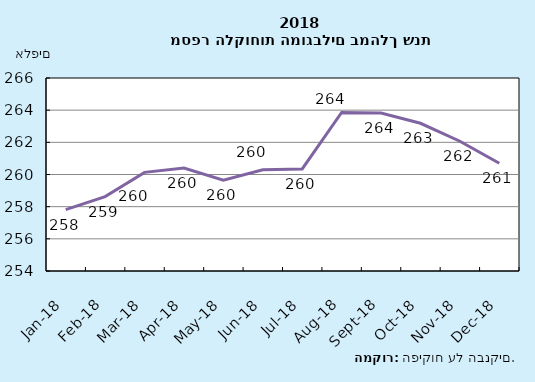
| Category | סה"כ לקוחות |
|---|---|
| 2018-01-31 | 257.814 |
| 2018-02-28 | 258.623 |
| 2018-03-31 | 260.133 |
| 2018-04-30 | 260.399 |
| 2018-05-31 | 259.647 |
| 2018-06-30 | 260.298 |
| 2018-07-31 | 260.348 |
| 2018-08-31 | 263.854 |
| 2018-09-30 | 263.819 |
| 2018-10-31 | 263.185 |
| 2018-11-30 | 262.069 |
| 2018-12-31 | 260.7 |